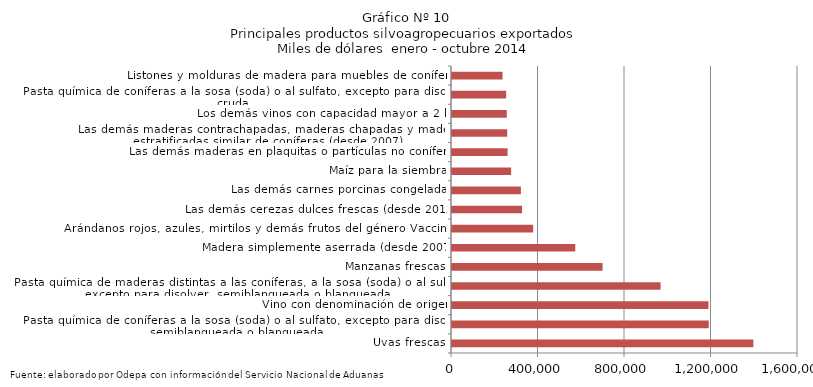
| Category | Series 0 |
|---|---|
| Uvas frescas | 1393623.593 |
| Pasta química de coníferas a la sosa (soda) o al sulfato, excepto para disolver, semiblanqueada o blanqueada | 1187421.552 |
| Vino con denominación de origen | 1186106.652 |
| Pasta química de maderas distintas a las coníferas, a la sosa (soda) o al sulfato, excepto para disolver, semiblanqueada o blanqueada | 964560.916 |
| Manzanas frescas | 696374.956 |
| Madera simplemente aserrada (desde 2007) | 570021.19 |
| Arándanos rojos, azules, mirtilos y demás frutos del género Vaccinium | 375362.422 |
| Las demás cerezas dulces frescas (desde 2012) | 324072.265 |
| Las demás carnes porcinas congeladas | 318496.967 |
| Maíz para la siembra | 273371.61 |
| Las demás maderas en plaquitas o partículas no coníferas | 257142.944 |
| Las demás maderas contrachapadas, maderas chapadas y maderas estratificadas similar de coníferas (desde 2007) | 255374.776 |
| Los demás vinos con capacidad mayor a 2 lts | 253413.802 |
| Pasta química de coníferas a la sosa (soda) o al sulfato, excepto para disolver, cruda | 250440.944 |
| Listones y molduras de madera para muebles de coníferas | 233705.081 |